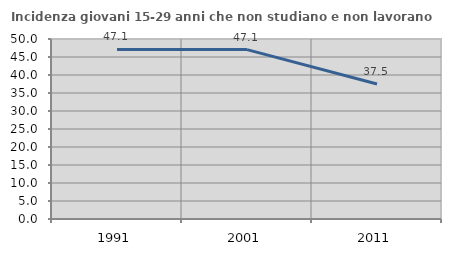
| Category | Incidenza giovani 15-29 anni che non studiano e non lavorano  |
|---|---|
| 1991.0 | 47.115 |
| 2001.0 | 47.059 |
| 2011.0 | 37.5 |